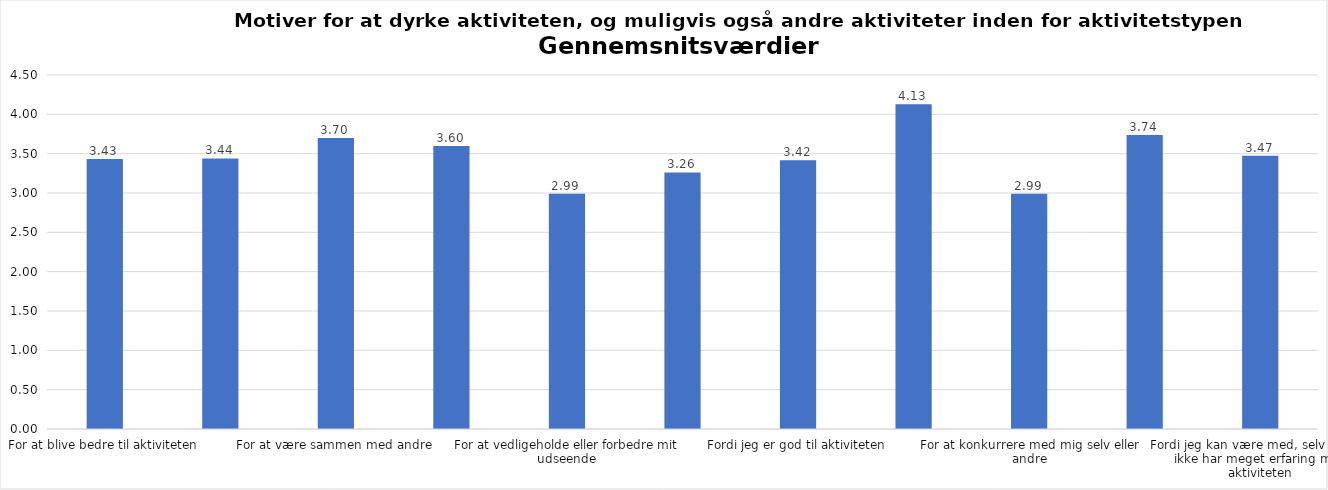
| Category | Gennemsnit |
|---|---|
| For at blive bedre til aktiviteten | 3.432 |
| For at vedligeholde eller forbedre min sundhed (fx helbred, fysisk form) | 3.439 |
| For at være sammen med andre | 3.701 |
| For at gøre noget godt for mig selv | 3.597 |
| For at vedligeholde eller forbedre mit udseende | 2.99 |
| Fordi andre i min omgangskreds opmuntrer mig til det | 3.262 |
| Fordi jeg er god til aktiviteten | 3.416 |
| Fordi jeg godt kan lide aktiviteten | 4.129 |
| For at konkurrere med mig selv eller andre | 2.992 |
| Fordi aktiviteten passer godt ind i min hverdag | 3.738 |
| Fordi jeg kan være med, selv om jeg ikke har meget erfaring med aktiviteten | 3.472 |